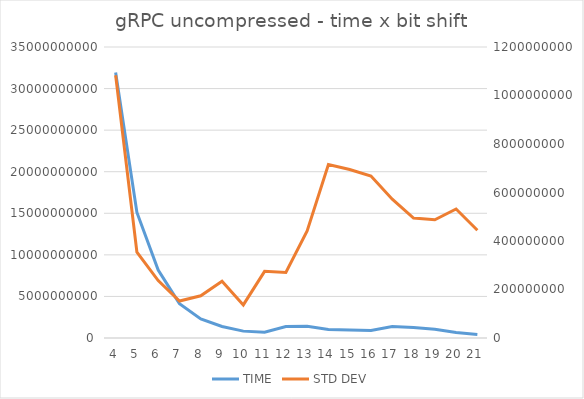
| Category | TIME |
|---|---|
| 4.0 | 31940933231.34 |
| 5.0 | 15105658216.92 |
| 6.0 | 8172340718.92 |
| 7.0 | 4132762142.88 |
| 8.0 | 2287546394.4 |
| 9.0 | 1384362749.06 |
| 10.0 | 826959013.98 |
| 11.0 | 697348702.24 |
| 12.0 | 1377638227.12 |
| 13.0 | 1403037666 |
| 14.0 | 1021507507.4 |
| 15.0 | 958959375.52 |
| 16.0 | 895776805.16 |
| 17.0 | 1368269752.22 |
| 18.0 | 1270882787.66 |
| 19.0 | 1046213394.28 |
| 20.0 | 654278720.18 |
| 21.0 | 430995131.44 |